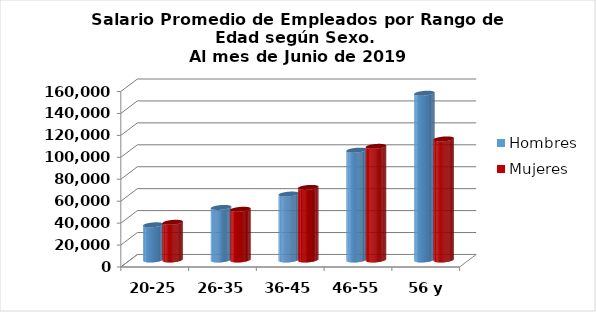
| Category | Hombres | Mujeres |
|---|---|---|
| 20-25 | 32089.778 | 34367.545 |
| 26-35 | 47930.354 | 46256.638 |
| 36-45 | 60125.993 | 66198.378 |
| 46-55 | 100143.544 | 103630.935 |
| 56 y más | 152044.216 | 110389.311 |